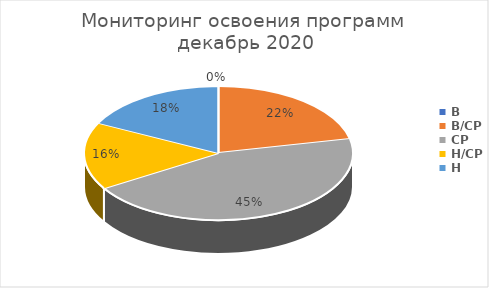
| Category | Series 0 |
|---|---|
| В | 0 |
| В/СР | 16 |
| СР | 33 |
| Н/СР | 12 |
| Н | 13 |